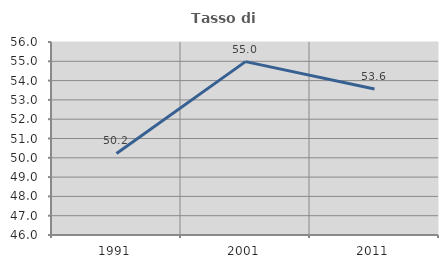
| Category | Tasso di occupazione   |
|---|---|
| 1991.0 | 50.227 |
| 2001.0 | 54.984 |
| 2011.0 | 53.567 |